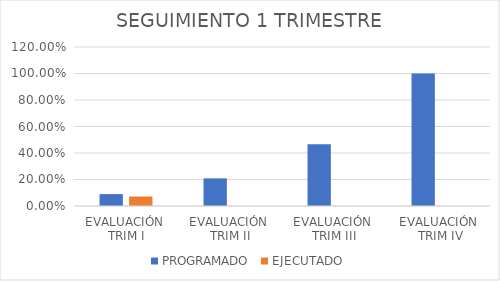
| Category | PROGRAMADO | EJECUTADO |
|---|---|---|
| EVALUACIÓN 
TRIM I | 0.09 | 0.072 |
| EVALUACIÓN 
TRIM II | 0.209 | 0 |
| EVALUACIÓN 
TRIM III | 0.466 | 0 |
| EVALUACIÓN
 TRIM IV | 1 | 0 |